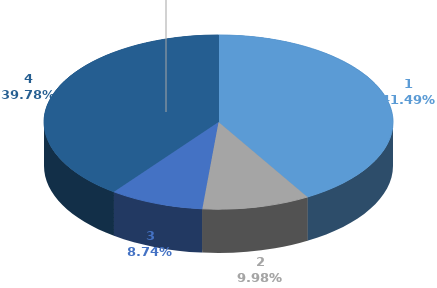
| Category | Series 0 | Series 1 |
|---|---|---|
| 0 | 1599226 |  |
| 1 | 384815 |  |
| 2 | 337019 |  |
| 3 | 1533122 |  |